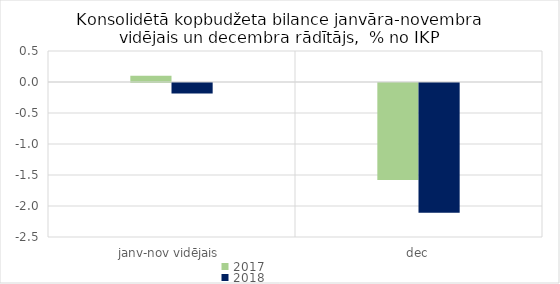
| Category | 2017 | 2018 |
|---|---|---|
| janv-nov vidējais | 0.103 | -0.169 |
| dec | -1.563 | -2.092 |